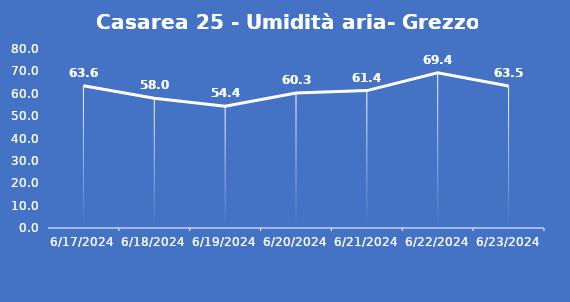
| Category | Casarea 25 - Umidità aria- Grezzo (%) |
|---|---|
| 6/17/24 | 63.6 |
| 6/18/24 | 58 |
| 6/19/24 | 54.4 |
| 6/20/24 | 60.3 |
| 6/21/24 | 61.4 |
| 6/22/24 | 69.4 |
| 6/23/24 | 63.5 |